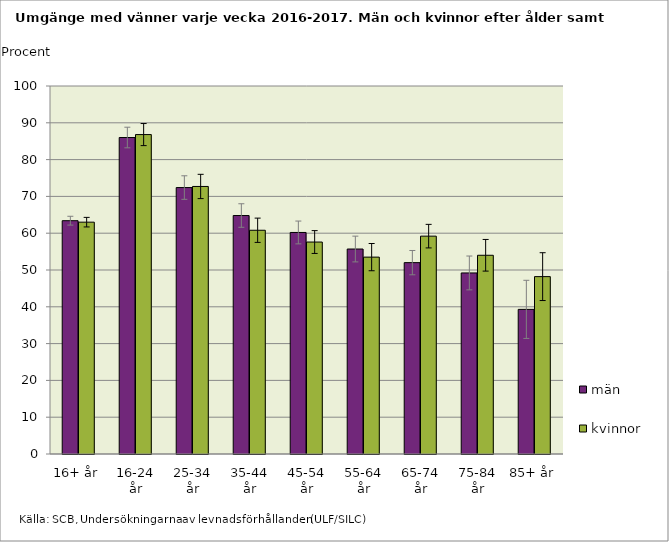
| Category | män | kvinnor |
|---|---|---|
| 16+ år | 63.4 | 63 |
| 16-24 år | 86 | 86.8 |
| 25-34 år | 72.4 | 72.7 |
| 35-44 år | 64.8 | 60.8 |
| 45-54 år | 60.2 | 57.6 |
| 55-64 år | 55.7 | 53.5 |
| 65-74 år | 52 | 59.2 |
| 75-84 år | 49.2 | 54 |
| 85+ år | 39.3 | 48.2 |